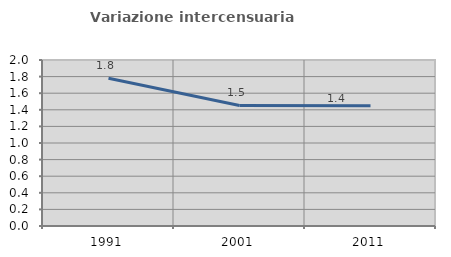
| Category | Variazione intercensuaria annua |
|---|---|
| 1991.0 | 1.781 |
| 2001.0 | 1.452 |
| 2011.0 | 1.449 |